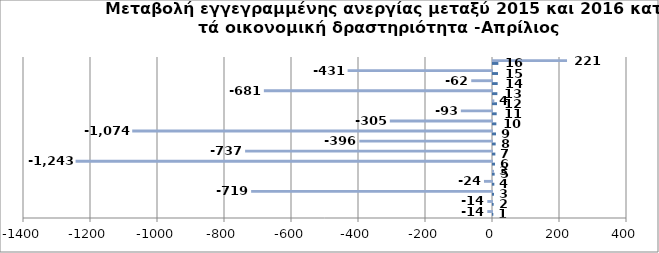
| Category | Series 0 | Series 1 |
|---|---|---|
| 0 | 1 | -14 |
| 1 | 2 | -14 |
| 2 | 3 | -719 |
| 3 | 4 | -24 |
| 4 | 5 | 3 |
| 5 | 6 | -1243 |
| 6 | 7 | -737 |
| 7 | 8 | -396 |
| 8 | 9 | -1074 |
| 9 | 10 | -305 |
| 10 | 11 | -93 |
| 11 | 12 | 4 |
| 12 | 13 | -681 |
| 13 | 14 | -62 |
| 14 | 15 | -431 |
| 15 | 16 | 221 |